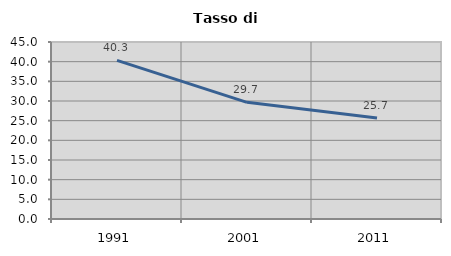
| Category | Tasso di disoccupazione   |
|---|---|
| 1991.0 | 40.335 |
| 2001.0 | 29.663 |
| 2011.0 | 25.686 |